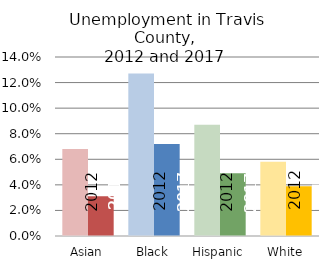
| Category | 2008-2012 | 2013-2017 |
|---|---|---|
| Asian | 0.068 | 0.031 |
| Black | 0.127 | 0.072 |
| Hispanic | 0.087 | 0.049 |
| White | 0.058 | 0.039 |